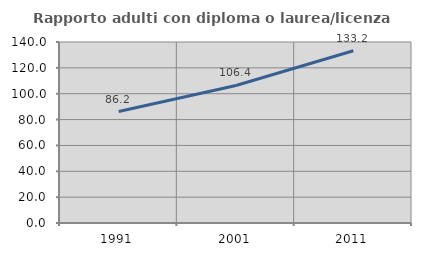
| Category | Rapporto adulti con diploma o laurea/licenza media  |
|---|---|
| 1991.0 | 86.207 |
| 2001.0 | 106.397 |
| 2011.0 | 133.224 |